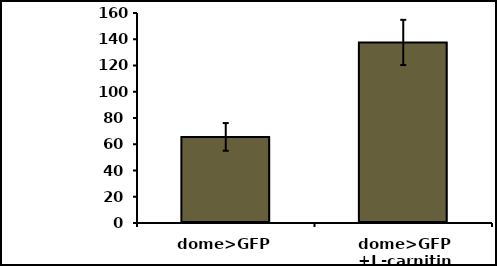
| Category | Series 0 |
|---|---|
| dome>GFP | 65.596 |
| dome>GFP +L-carnitine | 137.564 |